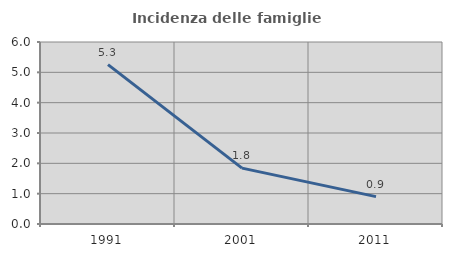
| Category | Incidenza delle famiglie numerose |
|---|---|
| 1991.0 | 5.253 |
| 2001.0 | 1.842 |
| 2011.0 | 0.903 |